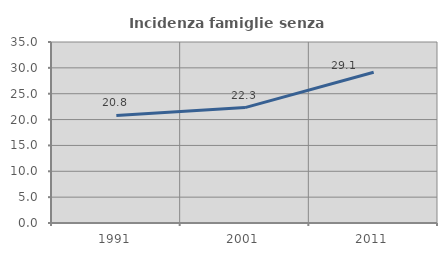
| Category | Incidenza famiglie senza nuclei |
|---|---|
| 1991.0 | 20.796 |
| 2001.0 | 22.313 |
| 2011.0 | 29.138 |